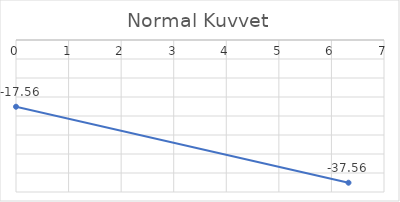
| Category | Series 0 |
|---|---|
| 0.0 | -17.558 |
| 6.324555320336759 | -37.558 |